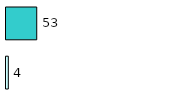
| Category | Series 0 | Series 1 |
|---|---|---|
| 0 | 4 | 53 |